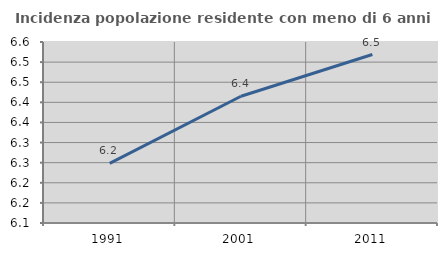
| Category | Incidenza popolazione residente con meno di 6 anni |
|---|---|
| 1991.0 | 6.248 |
| 2001.0 | 6.415 |
| 2011.0 | 6.519 |